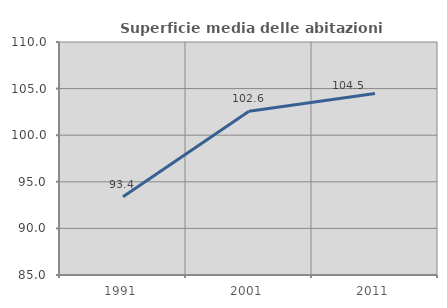
| Category | Superficie media delle abitazioni occupate |
|---|---|
| 1991.0 | 93.385 |
| 2001.0 | 102.581 |
| 2011.0 | 104.464 |